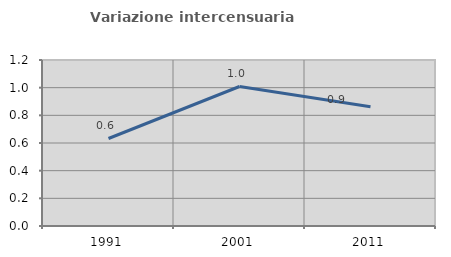
| Category | Variazione intercensuaria annua |
|---|---|
| 1991.0 | 0.633 |
| 2001.0 | 1.009 |
| 2011.0 | 0.862 |